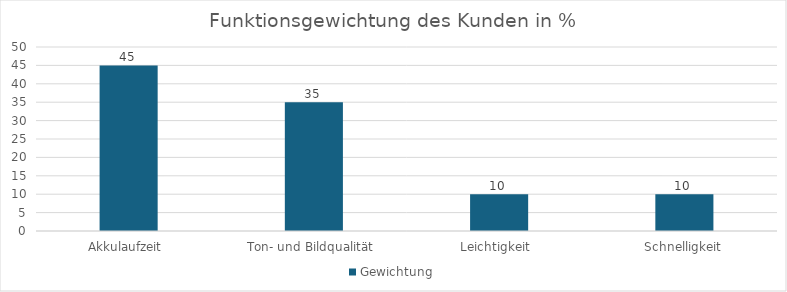
| Category | Gewichtung |
|---|---|
| Akkulaufzeit  | 45 |
| Ton- und Bildqualität  | 35 |
| Leichtigkeit  | 10 |
| Schnelligkeit | 10 |